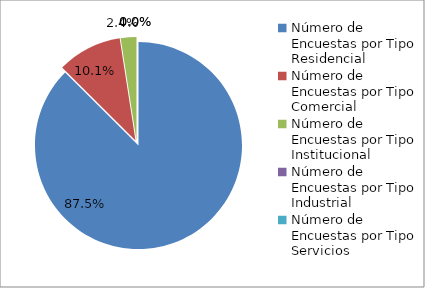
| Category | Series 0 |
|---|---|
| 0 | 286 |
| 1 | 33 |
| 2 | 8 |
| 3 | 0 |
| 4 | 0 |